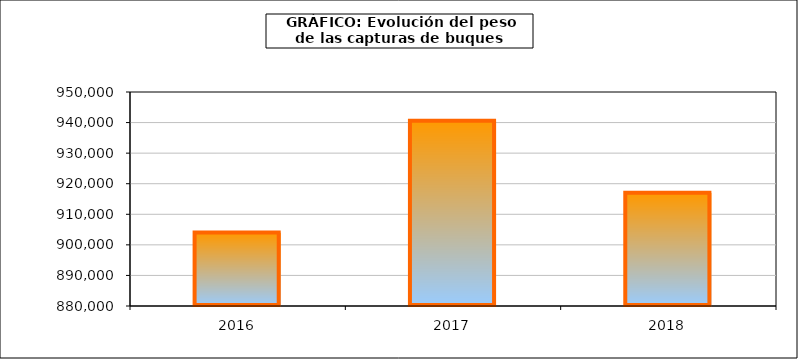
| Category | Series1 |
|---|---|
| 2016.0 | 904031.611 |
| 2017.0 | 940633.127 |
| 2018.0 | 917012.01 |